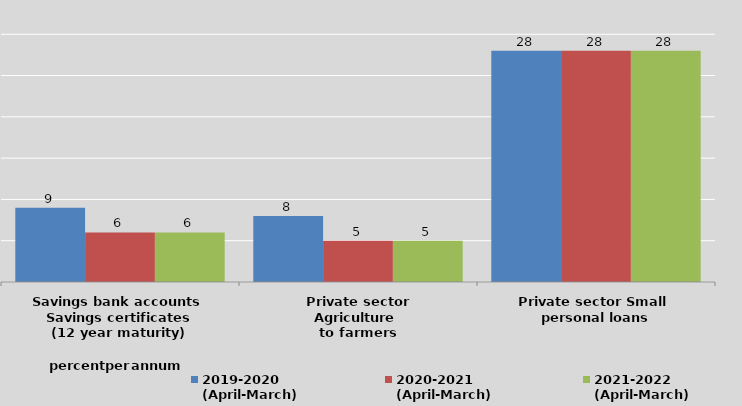
| Category | 2019-2020
(April-March) | 2020-2021
(April-March)  | 2021-2022 
(April-March) |
|---|---|---|---|
| Savings bank accounts 
Savings certificates
(12 year maturity) | 9 | 6 | 6 |
| Private sector Agriculture 
to farmers | 8 | 5 | 5 |
| Private sector Small 
personal loans | 28 | 28 | 28 |